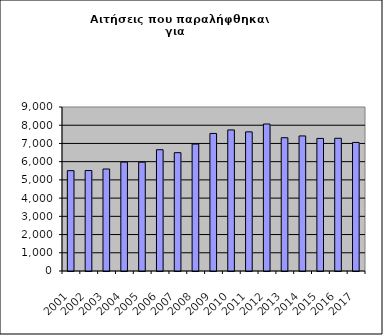
| Category | Series 1 |
|---|---|
| 2001.0 | 5507 |
| 2002.0 | 5513 |
| 2003.0 | 5597 |
| 2004.0 | 5974 |
| 2005.0 | 5970 |
| 2006.0 | 6656 |
| 2007.0 | 6494 |
| 2008.0 | 6966 |
| 2009.0 | 7549 |
| 2010.0 | 7742 |
| 2011.0 | 7635 |
| 2012.0 | 8067 |
| 2013.0 | 7314 |
| 2014.0 | 7412 |
| 2015.0 | 7276 |
| 2016.0 | 7283 |
| 2017.0 | 7056 |